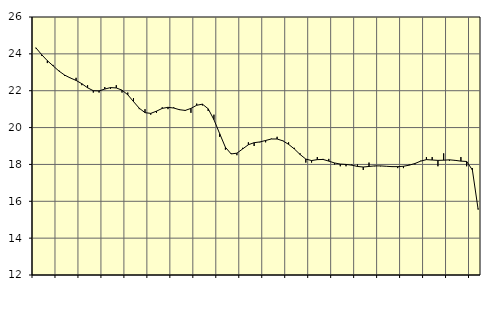
| Category | Piggar | Tillverkning o utvinning, energi o miljö, SNI 05-33, 35-39 |
|---|---|---|
| nan | 24.3 | 24.33 |
| 1.0 | 23.9 | 23.96 |
| 1.0 | 23.5 | 23.63 |
| 1.0 | 23.4 | 23.35 |
| nan | 23.1 | 23.07 |
| 2.0 | 22.8 | 22.85 |
| 2.0 | 22.7 | 22.69 |
| 2.0 | 22.7 | 22.56 |
| nan | 22.3 | 22.38 |
| 3.0 | 22.3 | 22.16 |
| 3.0 | 21.9 | 22 |
| 3.0 | 21.9 | 21.99 |
| nan | 22.2 | 22.09 |
| 4.0 | 22.1 | 22.17 |
| 4.0 | 22.3 | 22.15 |
| 4.0 | 21.9 | 22.03 |
| nan | 21.9 | 21.78 |
| 5.0 | 21.6 | 21.41 |
| 5.0 | 21 | 21.05 |
| 5.0 | 21 | 20.81 |
| nan | 20.7 | 20.77 |
| 6.0 | 20.8 | 20.89 |
| 6.0 | 21.1 | 21.04 |
| 6.0 | 21 | 21.1 |
| nan | 21.1 | 21.06 |
| 7.0 | 21 | 20.97 |
| 7.0 | 20.9 | 20.93 |
| 7.0 | 20.8 | 21.04 |
| nan | 21.3 | 21.21 |
| 8.0 | 21.2 | 21.27 |
| 8.0 | 20.9 | 21.02 |
| 8.0 | 20.7 | 20.43 |
| nan | 19.5 | 19.67 |
| 9.0 | 18.8 | 18.93 |
| 9.0 | 18.6 | 18.57 |
| 9.0 | 18.5 | 18.61 |
| nan | 18.9 | 18.84 |
| 10.0 | 19.2 | 19.07 |
| 10.0 | 19 | 19.18 |
| 10.0 | 19.2 | 19.22 |
| nan | 19.2 | 19.3 |
| 11.0 | 19.4 | 19.38 |
| 11.0 | 19.5 | 19.38 |
| 11.0 | 19.3 | 19.28 |
| nan | 19.2 | 19.09 |
| 12.0 | 18.9 | 18.84 |
| 12.0 | 18.6 | 18.54 |
| 12.0 | 18.1 | 18.29 |
| nan | 18.1 | 18.21 |
| 13.0 | 18.4 | 18.26 |
| 13.0 | 18.3 | 18.27 |
| 13.0 | 18.3 | 18.18 |
| nan | 18 | 18.08 |
| 14.0 | 17.9 | 18.02 |
| 14.0 | 17.9 | 18 |
| 14.0 | 18 | 17.96 |
| nan | 18 | 17.89 |
| 15.0 | 17.7 | 17.86 |
| 15.0 | 18.1 | 17.89 |
| 15.0 | 17.9 | 17.92 |
| nan | 17.9 | 17.92 |
| 16.0 | 17.9 | 17.9 |
| 16.0 | 17.9 | 17.88 |
| 16.0 | 17.8 | 17.88 |
| nan | 17.8 | 17.9 |
| 17.0 | 18 | 17.96 |
| 17.0 | 18 | 18.05 |
| 17.0 | 18.2 | 18.18 |
| nan | 18.4 | 18.26 |
| 18.0 | 18.4 | 18.24 |
| 18.0 | 17.9 | 18.22 |
| 18.0 | 18.6 | 18.23 |
| nan | 18.2 | 18.25 |
| 19.0 | 18.2 | 18.22 |
| 19.0 | 18.4 | 18.18 |
| 19.0 | 17.9 | 18.16 |
| nan | 17.8 | 17.7 |
| 20.0 | 15.6 | 15.56 |